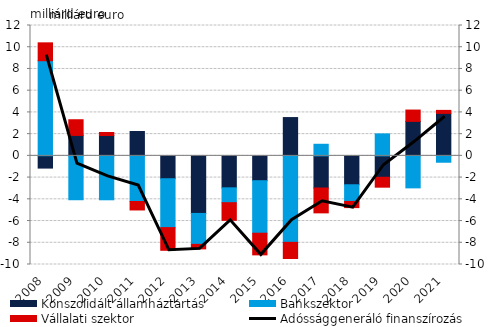
| Category | Konszolidált államháztartás | Bankszektor | Vállalati szektor |
|---|---|---|---|
| 2008.0 | -1.125 | 8.757 | 1.647 |
| 2009.0 | 1.882 | -4.038 | 1.444 |
| 2010.0 | 1.875 | -4.043 | 0.274 |
| 2011.0 | 2.243 | -4.2 | -0.78 |
| 2012.0 | -2.104 | -4.501 | -2.087 |
| 2013.0 | -5.3 | -2.846 | -0.416 |
| 2014.0 | -2.942 | -1.37 | -1.625 |
| 2015.0 | -2.287 | -4.833 | -1.993 |
| 2016.0 | 3.526 | -7.961 | -1.485 |
| 2017.0 | -2.959 | 1.067 | -2.287 |
| 2018.0 | -2.659 | -1.537 | -0.567 |
| 2019.0 | -1.972 | 2.023 | -0.911 |
| 2020.0 | 3.174 | -2.947 | 1.043 |
| 2021.0 | 3.911 | -0.587 | 0.275 |